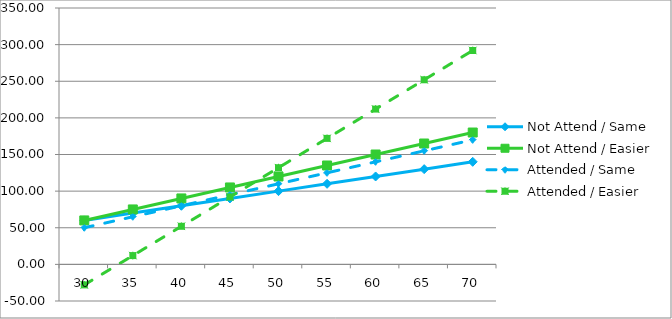
| Category | Not Attend / Same | Not Attend / Easier | Attended / Same | Attended / Easier |
|---|---|---|---|---|
| 30.0 | 60 | 60 | 50 | -28 |
| 35.0 | 70 | 75 | 65 | 12 |
| 40.0 | 80 | 90 | 80 | 52 |
| 45.0 | 90 | 105 | 95 | 92 |
| 50.0 | 100 | 120 | 110 | 132 |
| 55.0 | 110 | 135 | 125 | 172 |
| 60.0 | 120 | 150 | 140 | 212 |
| 65.0 | 130 | 165 | 155 | 252 |
| 70.0 | 140 | 180 | 170 | 292 |